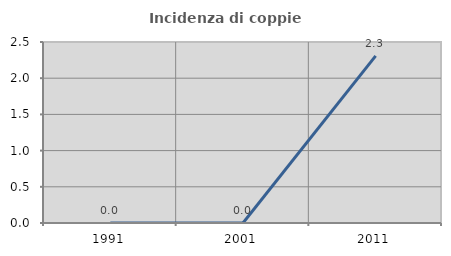
| Category | Incidenza di coppie miste |
|---|---|
| 1991.0 | 0 |
| 2001.0 | 0 |
| 2011.0 | 2.308 |